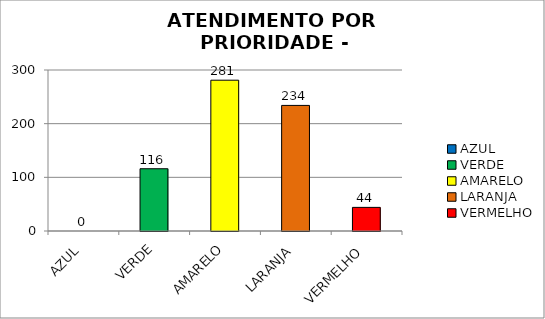
| Category | Total Regional: |
|---|---|
| AZUL | 0 |
| VERDE | 116 |
| AMARELO | 281 |
| LARANJA | 234 |
| VERMELHO | 44 |